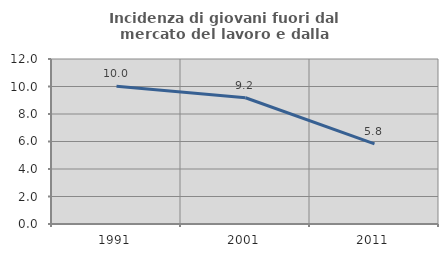
| Category | Incidenza di giovani fuori dal mercato del lavoro e dalla formazione  |
|---|---|
| 1991.0 | 10.022 |
| 2001.0 | 9.18 |
| 2011.0 | 5.825 |